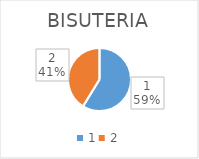
| Category | BISUTERIA |
|---|---|
| 0 | 15618 |
| 1 | 10968 |